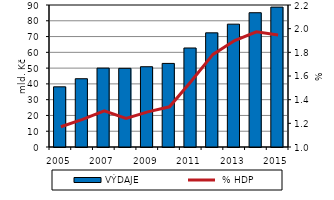
| Category | VÝDAJE |
|---|---|
| 2005.0 | 38.146 |
| 2006.0 | 43.268 |
| 2007.0 | 50.009 |
| 2008.0 | 49.872 |
| 2009.0 | 50.875 |
| 2010.0 | 52.974 |
| 2011.0 | 62.753 |
| 2012.0 | 72.36 |
| 2013.0 | 77.853 |
| 2014.0 | 85.104 |
| 2015.0 | 88.663 |